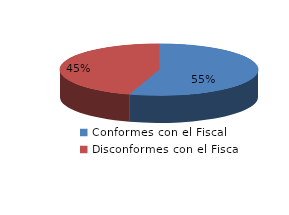
| Category | Series 0 |
|---|---|
| 0 | 1178 |
| 1 | 973 |